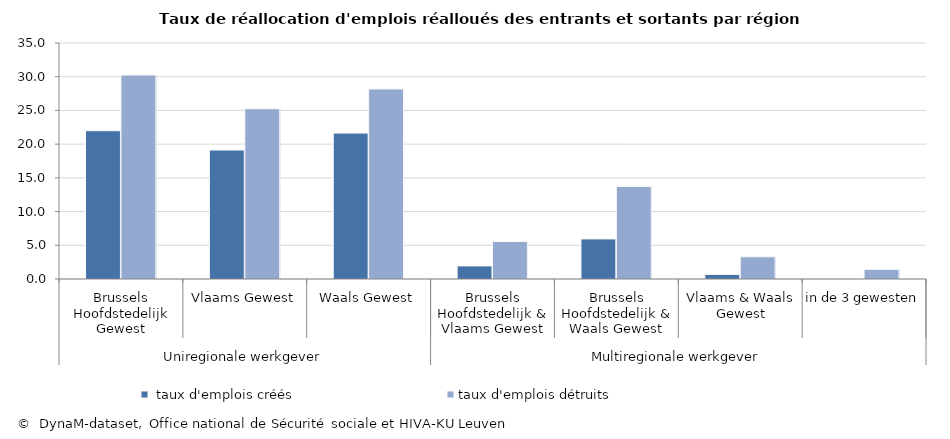
| Category |  taux d'emplois créés | taux d'emplois détruits |
|---|---|---|
| 0 | 21.989 | 30.252 |
| 1 | 19.127 | 25.248 |
| 2 | 21.642 | 28.181 |
| 3 | 1.941 | 5.562 |
| 4 | 5.946 | 13.73 |
| 5 | 0.682 | 3.286 |
| 6 | 0 | 1.431 |